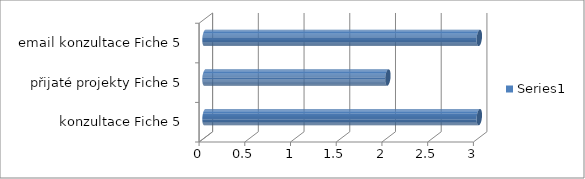
| Category | Series 0 |
|---|---|
|  konzultace Fiche 5 | 3 |
| přijaté projekty Fiche 5 | 2 |
| email konzultace Fiche 5 | 3 |